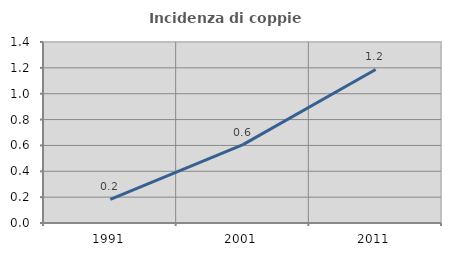
| Category | Incidenza di coppie miste |
|---|---|
| 1991.0 | 0.183 |
| 2001.0 | 0.607 |
| 2011.0 | 1.187 |